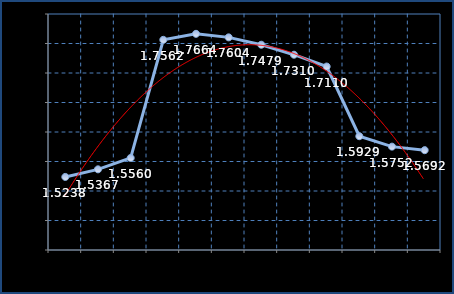
| Category | Series 0 |
|---|---|
| Jan 15 | 1.524 |
| Feb 15 | 1.537 |
| Mar 15 | 1.556 |
| Apr 15 | 1.756 |
| May 15 | 1.766 |
| Jun 15 | 1.76 |
| Jul 15 | 1.748 |
| Aug 15 | 1.731 |
| Sep 15 | 1.711 |
| Oct 15 | 1.593 |
| Nov 15 | 1.575 |
| Dec 15 | 1.569 |